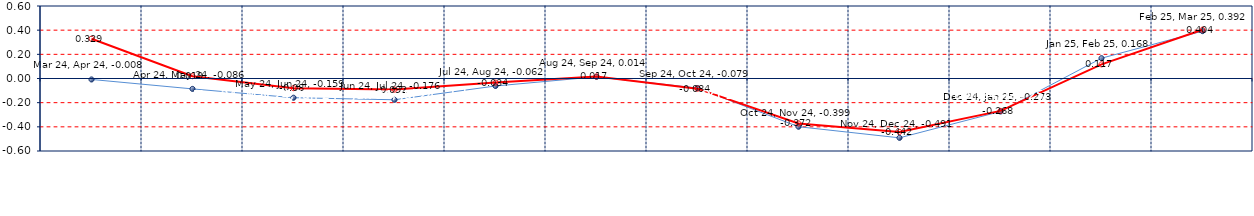
| Category | Last | Historical |
|---|---|---|
| Mar 24, Apr 24 | -0.008 | 0.329 |
| Apr 24, May 24 | -0.086 | 0.019 |
| May 24, Jun 24 | -0.159 | -0.08 |
| Jun 24, Jul 24 | -0.176 | -0.092 |
| Jul 24, Aug 24 | -0.062 | -0.034 |
| Aug 24, Sep 24 | 0.014 | 0.017 |
| Sep 24, Oct 24 | -0.079 | -0.084 |
| Oct 24, Nov 24 | -0.399 | -0.372 |
| Nov 24, Dec 24 | -0.491 | -0.442 |
| Dec 24, Jan 25 | -0.273 | -0.268 |
| Jan 25, Feb 25 | 0.168 | 0.117 |
| Feb 25, Mar 25 | 0.392 | 0.404 |